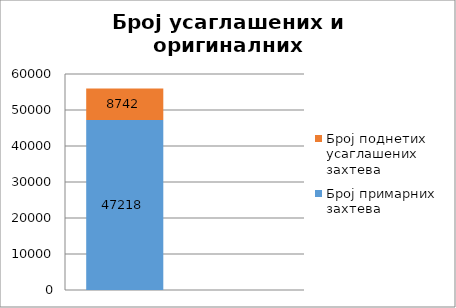
| Category | Број примарних захтева | Број поднетих усаглашених захтева |
|---|---|---|
| 0 | 47218 | 8742 |
| 1 | 0.844 | 0.156 |